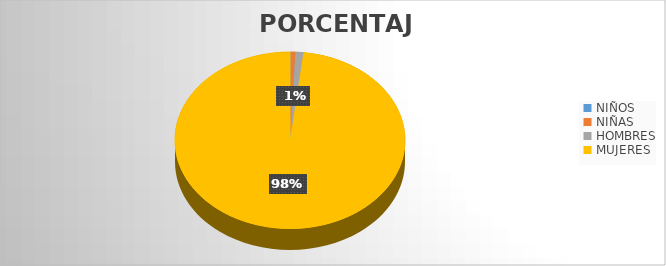
| Category | PORCENTAJE | CANTIDAD |
|---|---|---|
| NIÑOS  | 0.075 | 1 |
| NIÑAS | 0.671 | 9 |
| HOMBRES | 1.119 | 15 |
| MUJERES | 98.136 | 1316 |